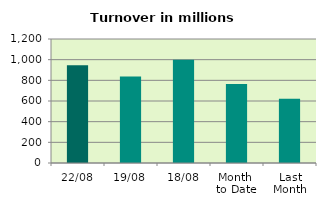
| Category | Series 0 |
|---|---|
| 22/08 | 946.622 |
| 19/08 | 836.892 |
| 18/08 | 998.448 |
| Month 
to Date | 765.469 |
| Last
Month | 622.259 |